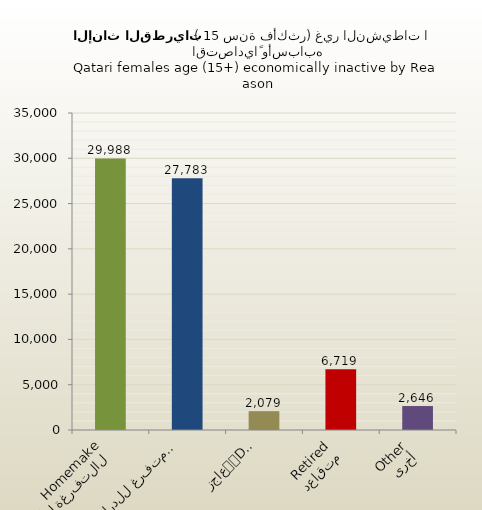
| Category | الاناث القطريات |
|---|---|
| التفرغة لأعمال المنزل
Homemaker | 29988 |
| متفرغ للدراسة
Student | 27783 |
| عاجز
Disabled | 2079 |
| متقاعد
Retired | 6719 |
| أخرى
Other | 2646 |